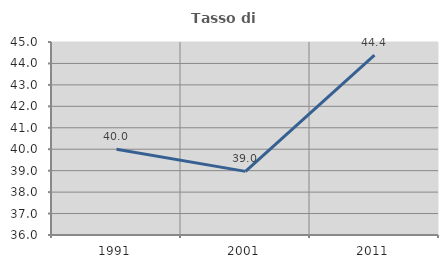
| Category | Tasso di occupazione   |
|---|---|
| 1991.0 | 40 |
| 2001.0 | 38.967 |
| 2011.0 | 44.388 |